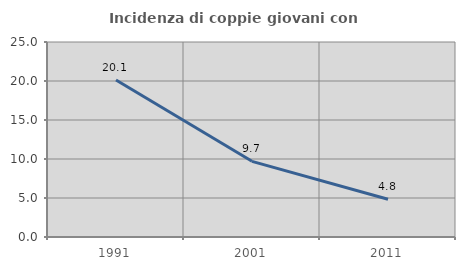
| Category | Incidenza di coppie giovani con figli |
|---|---|
| 1991.0 | 20.119 |
| 2001.0 | 9.702 |
| 2011.0 | 4.832 |